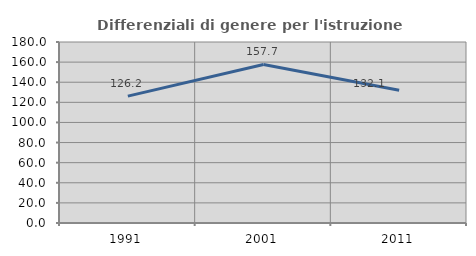
| Category | Differenziali di genere per l'istruzione superiore |
|---|---|
| 1991.0 | 126.187 |
| 2001.0 | 157.674 |
| 2011.0 | 132.05 |